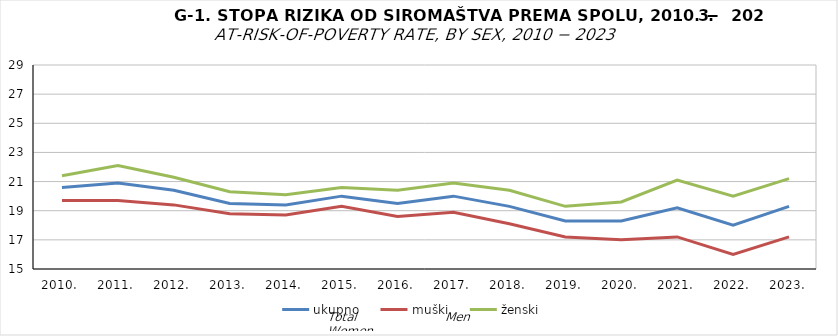
| Category | ukupno | muški | ženski |
|---|---|---|---|
| 2010. | 20.6 | 19.7 | 21.4 |
| 2011. | 20.9 | 19.7 | 22.1 |
| 2012. | 20.4 | 19.4 | 21.3 |
| 2013. | 19.5 | 18.8 | 20.3 |
| 2014. | 19.4 | 18.7 | 20.1 |
| 2015. | 20 | 19.3 | 20.6 |
| 2016. | 19.5 | 18.6 | 20.4 |
| 2017. | 20 | 18.9 | 20.9 |
| 2018. | 19.3 | 18.1 | 20.4 |
| 2019. | 18.3 | 17.2 | 19.3 |
| 2020. | 18.3 | 17 | 19.6 |
| 2021. | 19.2 | 17.2 | 21.1 |
| 2022. | 18 | 16 | 20 |
| 2023. | 19.3 | 17.2 | 21.2 |